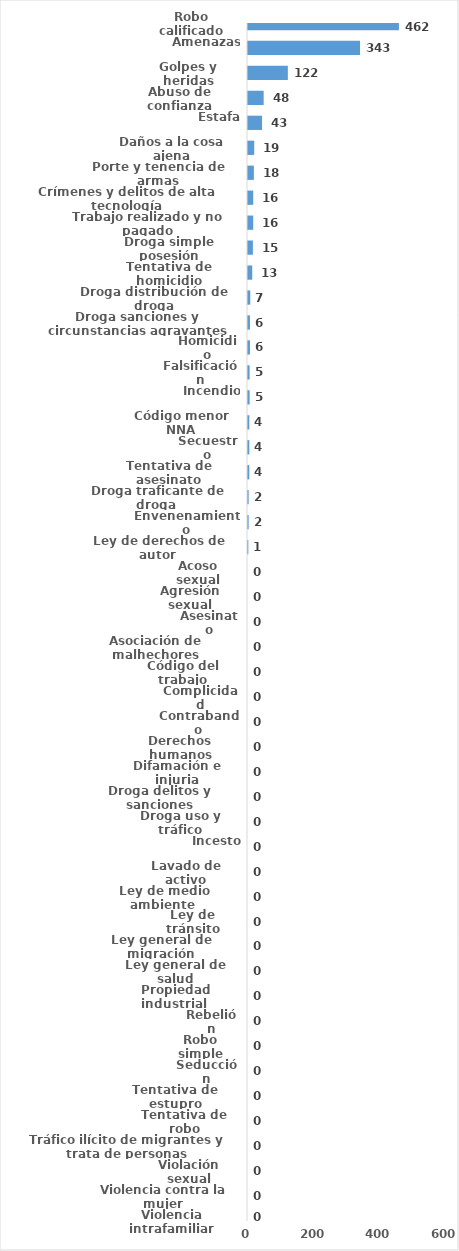
| Category | Series 0 |
|---|---|
| Robo calificado | 462 |
| Amenazas | 343 |
| Golpes y heridas | 122 |
| Abuso de confianza | 48 |
| Estafa | 43 |
| Daños a la cosa ajena | 19 |
| Porte y tenencia de armas | 18 |
| Crímenes y delitos de alta tecnología | 16 |
| Trabajo realizado y no pagado | 16 |
| Droga simple posesión | 15 |
| Tentativa de homicidio | 13 |
| Droga distribución de droga | 7 |
| Droga sanciones y circunstancias agravantes | 6 |
| Homicidio | 6 |
| Falsificación | 5 |
| Incendio | 5 |
| Código menor NNA | 4 |
| Secuestro | 4 |
| Tentativa de asesinato | 4 |
| Droga traficante de droga  | 2 |
| Envenenamiento | 2 |
| Ley de derechos de autor  | 1 |
| Acoso sexual | 0 |
| Agresión sexual | 0 |
| Asesinato | 0 |
| Asociación de malhechores | 0 |
| Código del trabajo | 0 |
| Complicidad | 0 |
| Contrabando | 0 |
| Derechos humanos | 0 |
| Difamación e injuria | 0 |
| Droga delitos y sanciones | 0 |
| Droga uso y tráfico | 0 |
| Incesto | 0 |
| Lavado de activo | 0 |
| Ley de medio ambiente  | 0 |
| Ley de tránsito | 0 |
| Ley general de migración | 0 |
| Ley general de salud | 0 |
| Propiedad industrial  | 0 |
| Rebelión | 0 |
| Robo simple | 0 |
| Seducción | 0 |
| Tentativa de estupro | 0 |
| Tentativa de robo | 0 |
| Tráfico ilícito de migrantes y trata de personas | 0 |
| Violación sexual | 0 |
| Violencia contra la mujer | 0 |
| Violencia intrafamiliar | 0 |